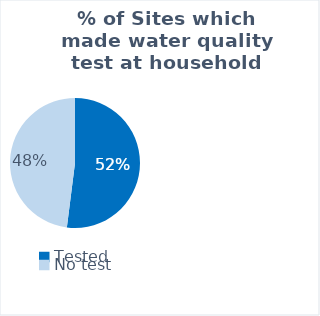
| Category | Central Rakhine |
|---|---|
| Tested | 13 |
| No test | 12 |